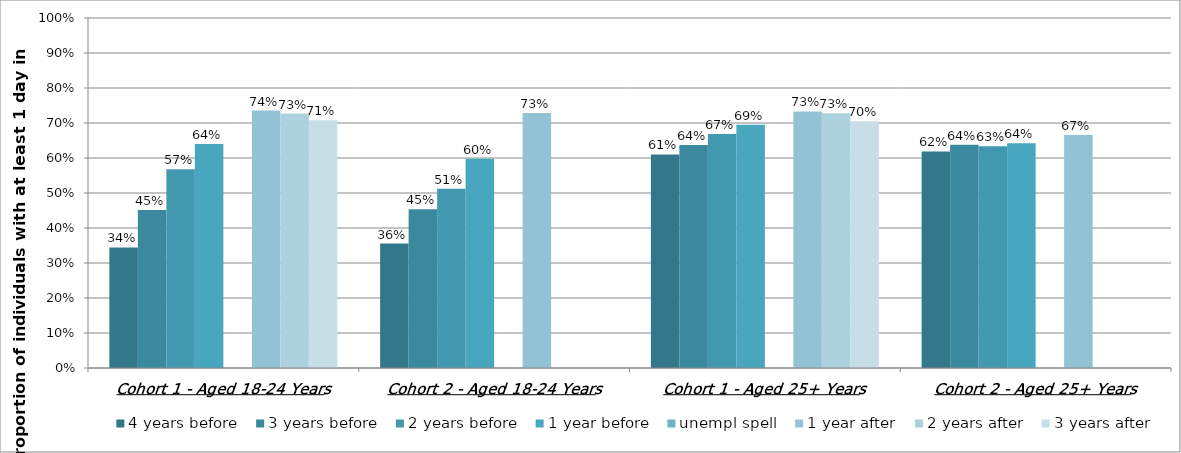
| Category | 4 years before | 3 years before | 2 years before | 1 year before | unempl spell | 1 year after | 2 years after | 3 years after |
|---|---|---|---|---|---|---|---|---|
| Cohort 1 - Aged 18-24 Years | 0.344 | 0.451 | 0.568 | 0.64 | 0 | 0.736 | 0.727 | 0.708 |
| Cohort 2 - Aged 18-24 Years | 0.355 | 0.453 | 0.512 | 0.598 | 0 | 0.728 | 0 | 0 |
| Cohort 1 - Aged 25+ Years | 0.61 | 0.637 | 0.668 | 0.695 | 0 | 0.733 | 0.728 | 0.705 |
| Cohort 2 - Aged 25+ Years | 0.619 | 0.638 | 0.634 | 0.642 | 0 | 0.666 | 0 | 0 |